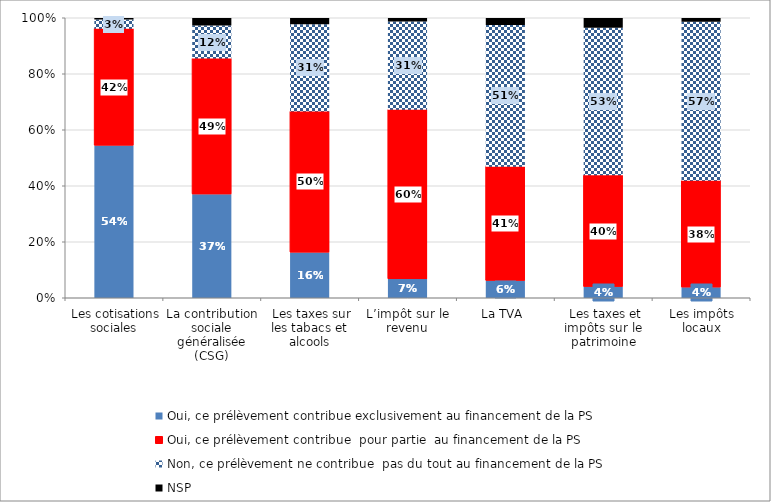
| Category | Oui, ce prélèvement contribue exclusivement au financement de la PS | Oui, ce prélèvement contribue  pour partie  au financement de la PS | Non, ce prélèvement ne contribue  pas du tout au financement de la PS  | NSP |
|---|---|---|---|---|
|  Les cotisations sociales | 0.544 | 0.417 | 0.033 | 0.005 |
| La contribution sociale généralisée (CSG) | 0.371 | 0.485 | 0.118 | 0.027 |
|  Les taxes sur les tabacs et alcools | 0.163 | 0.504 | 0.312 | 0.022 |
| L’impôt sur le revenu | 0.067 | 0.599 | 0.312 | 0.012 |
| La TVA  | 0.062 | 0.407 | 0.506 | 0.025 |
|  Les taxes et impôts sur le patrimoine | 0.04 | 0.398 | 0.527 | 0.035 |
| Les impôts locaux | 0.038 | 0.381 | 0.568 | 0.013 |